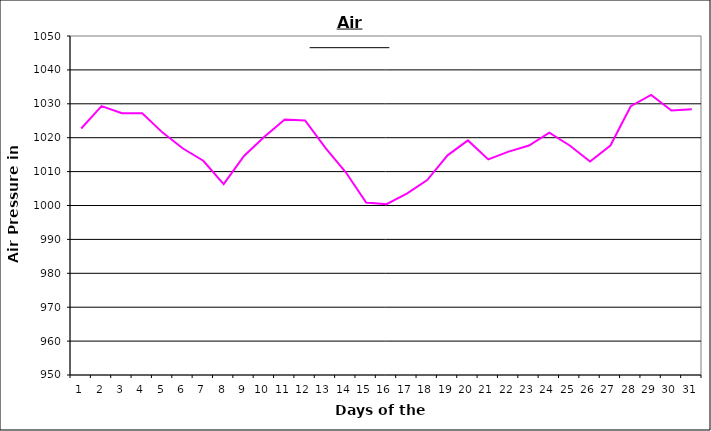
| Category | Series 0 |
|---|---|
| 0 | 1022.7 |
| 1 | 1029.3 |
| 2 | 1027.2 |
| 3 | 1027.2 |
| 4 | 1021.5 |
| 5 | 1016.8 |
| 6 | 1013.2 |
| 7 | 1006.3 |
| 8 | 1014.6 |
| 9 | 1020.3 |
| 10 | 1025.4 |
| 11 | 1025.1 |
| 12 | 1017 |
| 13 | 1009.8 |
| 14 | 1000.9 |
| 15 | 1000.4 |
| 16 | 1003.5 |
| 17 | 1007.5 |
| 18 | 1014.8 |
| 19 | 1019.2 |
| 20 | 1013.6 |
| 21 | 1015.9 |
| 22 | 1017.7 |
| 23 | 1021.5 |
| 24 | 1017.7 |
| 25 | 1013 |
| 26 | 1017.7 |
| 27 | 1029.3 |
| 28 | 1032.6 |
| 29 | 1028 |
| 30 | 1028.4 |